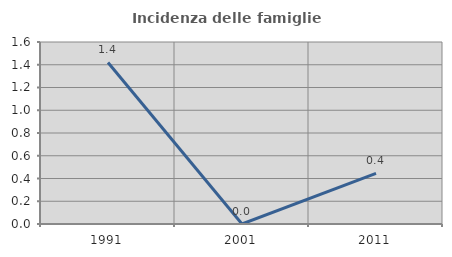
| Category | Incidenza delle famiglie numerose |
|---|---|
| 1991.0 | 1.42 |
| 2001.0 | 0 |
| 2011.0 | 0.445 |